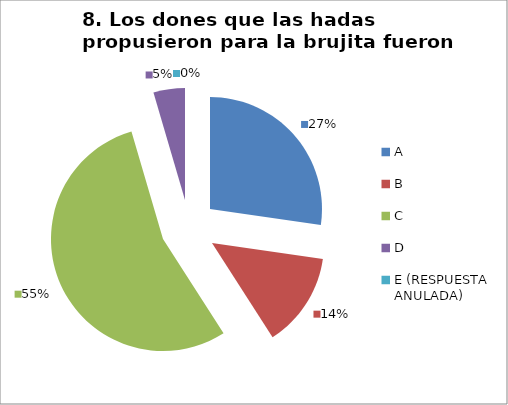
| Category | CANTIDAD DE RESPUESTAS PREGUNTA (8) | PORCENTAJE |
|---|---|---|
| A | 6 | 0.273 |
| B | 3 | 0.136 |
| C | 12 | 0.545 |
| D | 1 | 0.045 |
| E (RESPUESTA ANULADA) | 0 | 0 |